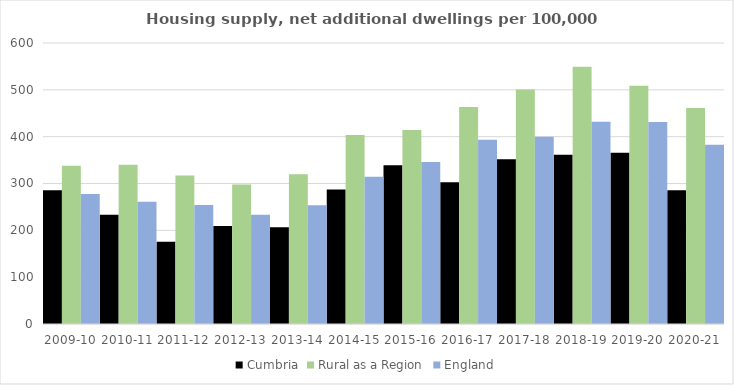
| Category | Cumbria | Rural as a Region | England |
|---|---|---|---|
| 2009-10 | 285.352 | 337.852 | 277.548 |
| 2010-11 | 233.123 | 340.105 | 260.994 |
| 2011-12 | 175.864 | 317.04 | 254.007 |
| 2012-13 | 209.333 | 297.763 | 233.153 |
| 2013-14 | 206.42 | 319.835 | 253.602 |
| 2014-15 | 286.932 | 403.796 | 314.256 |
| 2015-16 | 338.761 | 414.091 | 346.154 |
| 2016-17 | 302.931 | 463.209 | 393.256 |
| 2017-18 | 351.944 | 500.68 | 399.646 |
| 2018-19 | 361.203 | 549.491 | 432.099 |
| 2019-20 | 365.791 | 508.493 | 431.187 |
| 2020-21 | 285.725 | 461.114 | 382.827 |